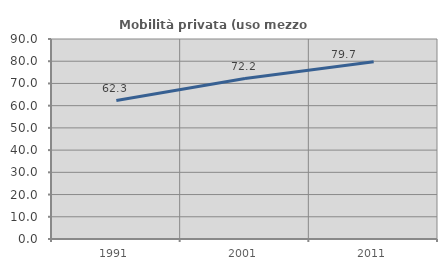
| Category | Mobilità privata (uso mezzo privato) |
|---|---|
| 1991.0 | 62.281 |
| 2001.0 | 72.222 |
| 2011.0 | 79.726 |